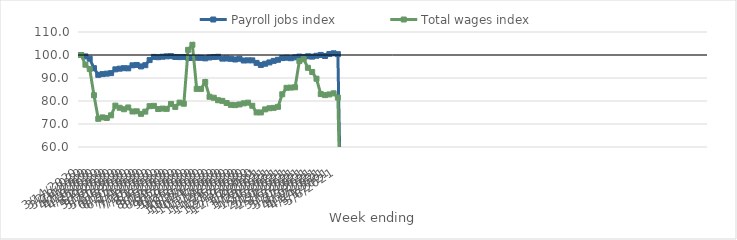
| Category | Payroll jobs index | Total wages index |
|---|---|---|
| 14/03/2020 | 100 | 100 |
| 21/03/2020 | 99.379 | 95.783 |
| 28/03/2020 | 98.374 | 93.96 |
| 04/04/2020 | 94.258 | 82.499 |
| 11/04/2020 | 91.377 | 72.255 |
| 18/04/2020 | 91.692 | 72.877 |
| 25/04/2020 | 91.897 | 72.617 |
| 02/05/2020 | 92.114 | 73.775 |
| 09/05/2020 | 93.762 | 77.994 |
| 16/05/2020 | 94.062 | 77.061 |
| 23/05/2020 | 94.263 | 76.419 |
| 30/05/2020 | 94.199 | 77.192 |
| 06/06/2020 | 95.511 | 75.441 |
| 13/06/2020 | 95.677 | 75.52 |
| 20/06/2020 | 95.035 | 74.411 |
| 27/06/2020 | 95.569 | 75.384 |
| 04/07/2020 | 97.792 | 77.758 |
| 11/07/2020 | 99.169 | 77.89 |
| 18/07/2020 | 99.037 | 76.513 |
| 25/07/2020 | 99.253 | 76.692 |
| 01/08/2020 | 99.41 | 76.582 |
| 08/08/2020 | 99.5 | 78.733 |
| 15/08/2020 | 99.141 | 77.437 |
| 22/08/2020 | 99.088 | 79.294 |
| 29/08/2020 | 99.143 | 78.817 |
| 05/09/2020 | 98.716 | 102.255 |
| 12/09/2020 | 98.72 | 104.442 |
| 19/09/2020 | 98.815 | 85.264 |
| 26/09/2020 | 98.772 | 85.243 |
| 03/10/2020 | 98.535 | 88.27 |
| 10/10/2020 | 98.932 | 81.825 |
| 17/10/2020 | 99.11 | 81.419 |
| 24/10/2020 | 99.224 | 80.334 |
| 31/10/2020 | 98.423 | 80.066 |
| 07/11/2020 | 98.473 | 79.126 |
| 14/11/2020 | 98.339 | 78.312 |
| 21/11/2020 | 98.046 | 78.201 |
| 28/11/2020 | 98.361 | 78.5 |
| 05/12/2020 | 97.605 | 78.98 |
| 12/12/2020 | 97.683 | 79.277 |
| 19/12/2020 | 97.667 | 77.923 |
| 26/12/2020 | 96.569 | 75.031 |
| 02/01/2021 | 95.669 | 75.025 |
| 09/01/2021 | 96.2 | 76.347 |
| 16/01/2021 | 96.775 | 76.841 |
| 23/01/2021 | 97.446 | 77.018 |
| 30/01/2021 | 97.919 | 77.46 |
| 06/02/2021 | 98.653 | 82.916 |
| 13/02/2021 | 98.821 | 85.736 |
| 20/02/2021 | 98.597 | 85.832 |
| 27/02/2021 | 98.974 | 85.959 |
| 06/03/2021 | 99.304 | 97.375 |
| 13/03/2021 | 99.146 | 98.185 |
| 20/03/2021 | 99.433 | 94.431 |
| 27/03/2021 | 99.295 | 92.616 |
| 03/04/2021 | 99.668 | 89.689 |
| 10/04/2021 | 100.037 | 83.015 |
| 17/04/2021 | 99.556 | 82.56 |
| 24/04/2021 | 100.408 | 82.858 |
| 01/05/2021 | 100.734 | 83.348 |
| 08/05/2021 | 100.359 | 81.497 |